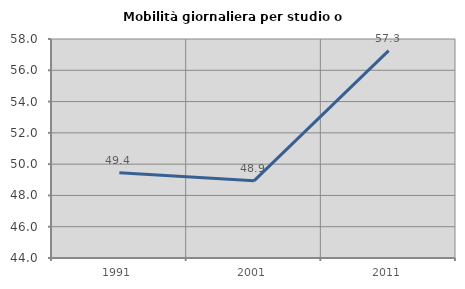
| Category | Mobilità giornaliera per studio o lavoro |
|---|---|
| 1991.0 | 49.449 |
| 2001.0 | 48.934 |
| 2011.0 | 57.257 |